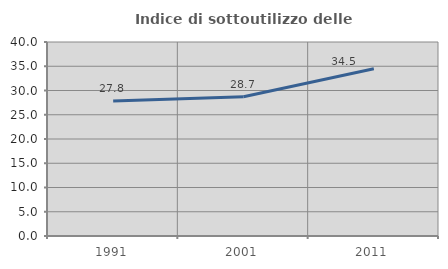
| Category | Indice di sottoutilizzo delle abitazioni  |
|---|---|
| 1991.0 | 27.845 |
| 2001.0 | 28.705 |
| 2011.0 | 34.471 |